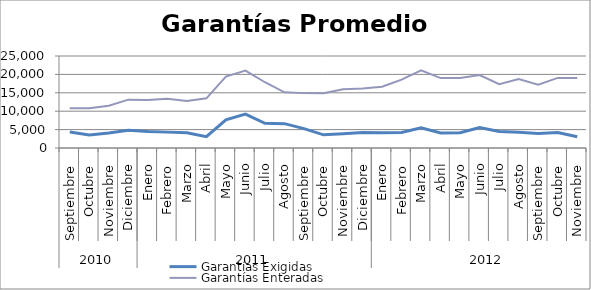
| Category | Garantías Exigidas | Garantías Enteradas |
|---|---|---|
| 0 | 4372.607 | 10829.062 |
| 1 | 3557.93 | 10787.9 |
| 2 | 4056.528 | 11463.422 |
| 3 | 4832.111 | 13142.881 |
| 4 | 4466.32 | 13061.162 |
| 5 | 4313.718 | 13357.444 |
| 6 | 4162.491 | 12796.251 |
| 7 | 3090.395 | 13495.263 |
| 8 | 7655.186 | 19416.342 |
| 9 | 9198.096 | 21035.301 |
| 10 | 6699.851 | 17866.843 |
| 11 | 6615.292 | 15119.839 |
| 12 | 5266.973 | 14911.639 |
| 13 | 3572.137 | 14861.465 |
| 14 | 3876.388 | 15976.819 |
| 15 | 4182.413 | 16147.351 |
| 16 | 4146.8 | 16662.483 |
| 17 | 4190.531 | 18572.749 |
| 18 | 5482.211 | 21128.648 |
| 19 | 4079.038 | 18997.51 |
| 20 | 4141.554 | 19005.364 |
| 21 | 5549.139 | 19818.91 |
| 22 | 4487.023 | 17351.39 |
| 23 | 4277.924 | 18719.955 |
| 24 | 3940.893 | 17217.403 |
| 25 | 4180.69 | 19046.939 |
| 26 | 3056.997 | 19028.425 |